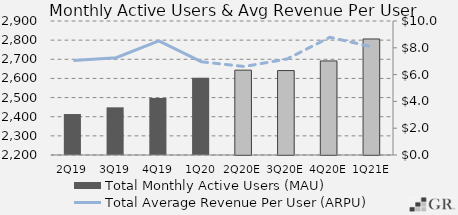
| Category | Total Monthly Active Users (MAU)  |
|---|---|
|  2Q19  | 2414 |
|  3Q19  | 2449 |
|  4Q19  | 2497.8 |
|  1Q20  | 2603 |
|  2Q20E  | 2643.21 |
|  3Q20E  | 2641.022 |
|  4Q20E  | 2691.443 |
|  1Q21E  | 2806.13 |